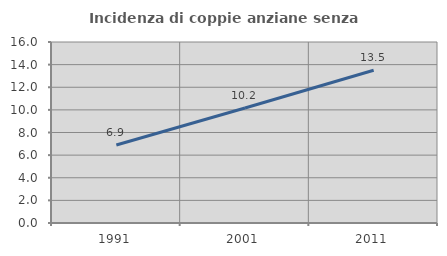
| Category | Incidenza di coppie anziane senza figli  |
|---|---|
| 1991.0 | 6.901 |
| 2001.0 | 10.161 |
| 2011.0 | 13.504 |